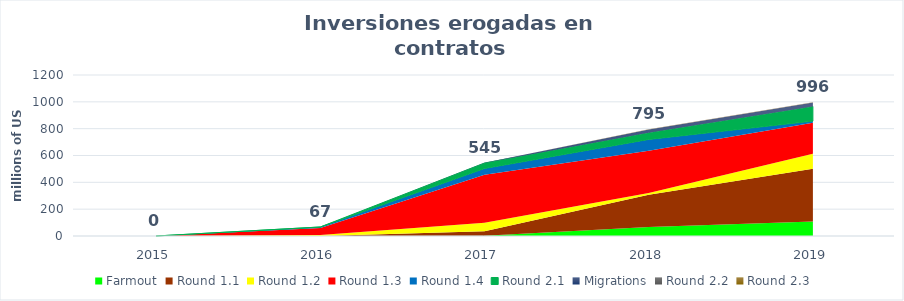
| Category | Series 7 |
|---|---|
| 2015.0 | 0.026 |
| 2016.0 | 67.154 |
| 2017.0 | 545.249 |
| 2018.0 | 794.797 |
| 2019.0 | 995.996 |